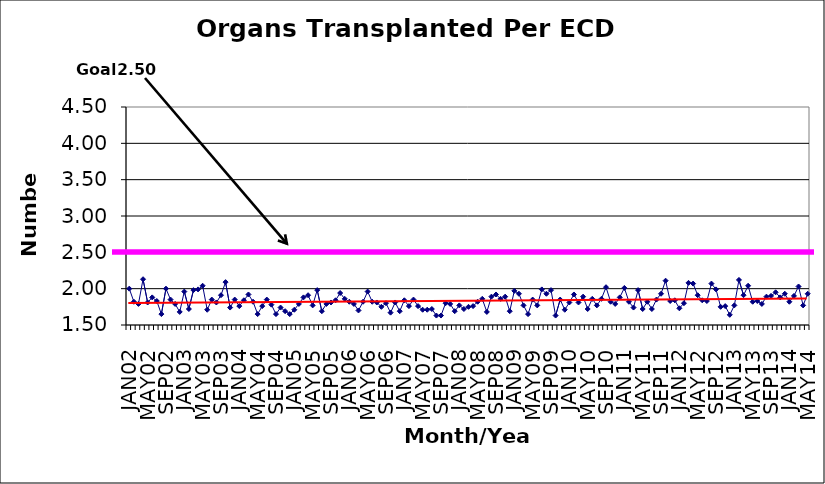
| Category | Series 0 |
|---|---|
| JAN02 | 2 |
| FEB02 | 1.82 |
| MAR02 | 1.79 |
| APR02 | 2.13 |
| MAY02 | 1.81 |
| JUN02 | 1.88 |
| JUL02 | 1.83 |
| AUG02 | 1.65 |
| SEP02 | 2 |
| OCT02 | 1.85 |
| NOV02 | 1.79 |
| DEC02 | 1.68 |
| JAN03 | 1.96 |
| FEB03 | 1.72 |
| MAR03 | 1.98 |
| APR03 | 1.99 |
| MAY03 | 2.04 |
| JUN03 | 1.71 |
| JUL03 | 1.85 |
| AUG03 | 1.81 |
| SEP03 | 1.91 |
| OCT03 | 2.09 |
| NOV03 | 1.74 |
| DEC03 | 1.85 |
| JAN04 | 1.76 |
| FEB04 | 1.84 |
| MAR04 | 1.92 |
| APR04 | 1.82 |
| MAY04 | 1.65 |
| JUN04 | 1.76 |
| JUL04 | 1.85 |
| AUG04 | 1.78 |
| SEP04 | 1.65 |
| OCT04 | 1.74 |
| NOV04 | 1.69 |
| DEC04 | 1.65 |
| JAN05 | 1.71 |
| FEB05 | 1.79 |
| MAR05 | 1.88 |
| APR05 | 1.91 |
| MAY05 | 1.77 |
| JUN05 | 1.98 |
| JUL05 | 1.69 |
| AUG05 | 1.79 |
| SEP05 | 1.81 |
| OCT05 | 1.84 |
| NOV05 | 1.94 |
| DEC05 | 1.86 |
| JAN06 | 1.82 |
| FEB06 | 1.79 |
| MAR06 | 1.7 |
| APR06 | 1.82 |
| MAY06 | 1.96 |
| JUN06 | 1.82 |
| JUL06 | 1.81 |
| AUG06 | 1.75 |
| SEP06 | 1.8 |
| OCT06 | 1.67 |
| NOV06 | 1.81 |
| DEC06 | 1.69 |
| JAN07 | 1.84 |
| FEB07 | 1.76 |
| MAR07 | 1.85 |
| APR07 | 1.76 |
| MAY07 | 1.71 |
| JUN07 | 1.71 |
| JUL07 | 1.72 |
| AUG07 | 1.63 |
| SEP07 | 1.63 |
| OCT07 | 1.8 |
| NOV07 | 1.79 |
| DEC07 | 1.69 |
| JAN08 | 1.77 |
| FEB08 | 1.72 |
| MAR08 | 1.75 |
| APR08 | 1.76 |
| MAY08 | 1.82 |
| JUN08 | 1.86 |
| JUL08 | 1.68 |
| AUG08 | 1.89 |
| SEP08 | 1.92 |
| OCT08 | 1.86 |
| NOV08 | 1.89 |
| DEC08 | 1.69 |
| JAN09 | 1.97 |
| FEB09 | 1.93 |
| MAR09 | 1.77 |
| APR09 | 1.65 |
| MAY09 | 1.85 |
| JUN09 | 1.77 |
| JUL09 | 1.99 |
| AUG09 | 1.93 |
| SEP09 | 1.98 |
| OCT09 | 1.63 |
| NOV09 | 1.85 |
| DEC09 | 1.71 |
| JAN10 | 1.81 |
| FEB10 | 1.92 |
| MAR10 | 1.81 |
| APR10 | 1.89 |
| MAY10 | 1.72 |
| JUN10 | 1.86 |
| JUL10 | 1.77 |
| AUG10 | 1.86 |
| SEP10 | 2.02 |
| OCT10 | 1.82 |
| NOV10 | 1.79 |
| DEC10 | 1.88 |
| JAN11 | 2.01 |
| FEB11 | 1.82 |
| MAR11 | 1.74 |
| APR11 | 1.98 |
| MAY11 | 1.72 |
| JUN11 | 1.82 |
| JUL11 | 1.72 |
| AUG11 | 1.85 |
| SEP11 | 1.93 |
| OCT11 | 2.11 |
| NOV11 | 1.83 |
| DEC11 | 1.84 |
| JAN12 | 1.73 |
| FEB12 | 1.8 |
| MAR12 | 2.08 |
| APR12 | 2.07 |
| MAY12 | 1.91 |
| JUN12 | 1.84 |
| JUL12 | 1.83 |
| AUG12 | 2.07 |
| SEP12 | 1.99 |
| OCT12 | 1.75 |
| NOV12 | 1.76 |
| DEC12 | 1.64 |
| JAN13 | 1.77 |
| FEB13 | 2.12 |
| MAR13 | 1.91 |
| APR13 | 2.04 |
| MAY13 | 1.82 |
| JUN13 | 1.83 |
| JUL13 | 1.79 |
| AUG13 | 1.89 |
| SEP13 | 1.9 |
| OCT13 | 1.95 |
| NOV13 | 1.88 |
| DEC13 | 1.93 |
| JAN14 | 1.82 |
| FEB14 | 1.9 |
| MAR14 | 2.03 |
| APR14 | 1.77 |
| MAY14 | 1.93 |